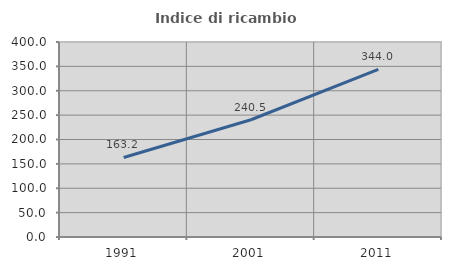
| Category | Indice di ricambio occupazionale  |
|---|---|
| 1991.0 | 163.158 |
| 2001.0 | 240.513 |
| 2011.0 | 343.976 |